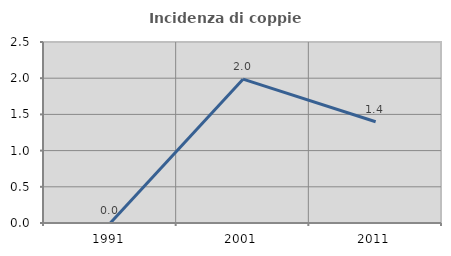
| Category | Incidenza di coppie miste |
|---|---|
| 1991.0 | 0 |
| 2001.0 | 1.987 |
| 2011.0 | 1.399 |